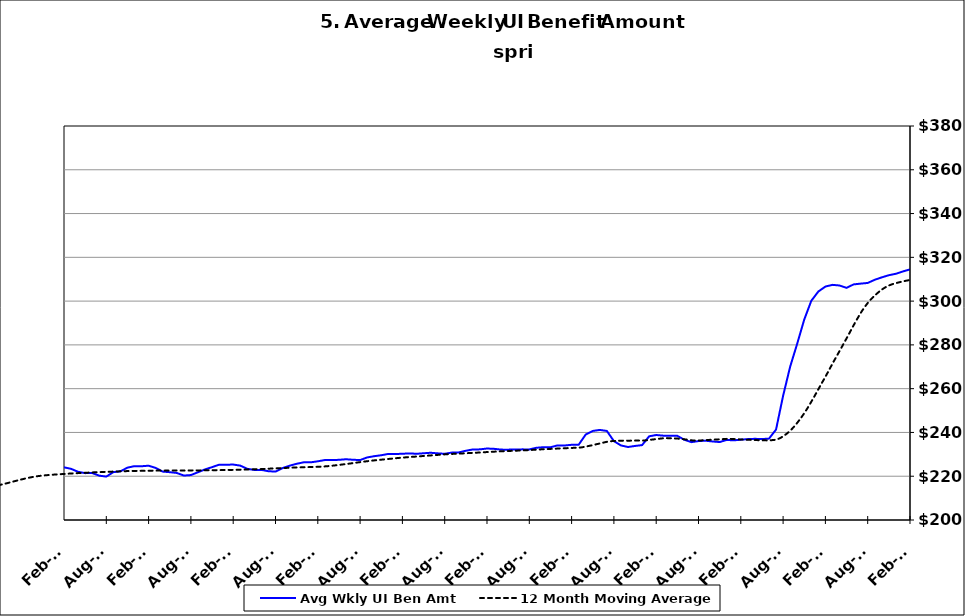
| Category | Avg Wkly UI Ben Amt |
|---|---|
| 1995-01-31 | 152.517 |
| 1995-02-28 | 151.164 |
| 1995-03-31 | 148.4 |
| 1995-04-30 | 146.034 |
| 1995-05-31 | 146.738 |
| 1995-06-30 | 147.885 |
| 1995-07-31 | 145.798 |
| 1995-08-31 | 144.052 |
| 1995-09-30 | 147.334 |
| 1995-10-31 | 151.535 |
| 1995-11-30 | 152.903 |
| 1995-12-31 | 153.258 |
| 1996-01-15 | 153.468 |
| 1996-02-15 | 153.032 |
| 1996-03-15 | 155.453 |
| 1996-04-15 | 148.614 |
| 1996-05-15 | 148.648 |
| 1996-06-15 | 150.145 |
| 1996-07-15 | 147.052 |
| 1996-08-15 | 146.042 |
| 1996-09-15 | 149.978 |
| 1996-10-15 | 151.319 |
| 1996-11-15 | 153.295 |
| 1996-12-15 | 155.775 |
| 1997-01-15 | 154.813 |
| 1997-02-15 | 151.102 |
| 1997-03-15 | 149.222 |
| 1997-04-15 | 145.178 |
| 1997-05-31 | 145.194 |
| 1997-06-30 | 146.718 |
| 1997-07-31 | 142.224 |
| 1997-08-31 | 142.382 |
| 1997-09-30 | 143.123 |
| 1997-10-31 | 146.797 |
| 1997-11-30 | 148.163 |
| 1997-12-31 | 147.967 |
| 1998-01-31 | 147.87 |
| 1998-02-28 | 147.591 |
| 1998-03-31 | 147.262 |
| 1998-04-30 | 144.746 |
| 1998-05-31 | 146.093 |
| 1998-06-30 | 147.355 |
| 1998-07-31 | 146.079 |
| 1998-08-31 | 147.387 |
| 1998-09-30 | 147.529 |
| 1998-10-31 | 152.825 |
| 1998-11-30 | 156.171 |
| 1998-12-31 | 156.424 |
| 1999-01-31 | 157.388 |
| 1999-02-28 | 157.868 |
| 1999-03-31 | 157.505 |
| 1999-04-30 | 153.987 |
| 1999-05-31 | 153.665 |
| 1999-06-30 | 153.746 |
| 1999-07-31 | 154.09 |
| 1999-08-31 | 156.162 |
| 1999-09-30 | 157.136 |
| 1999-10-31 | 162.476 |
| 1999-11-30 | 163.291 |
| 1999-12-31 | 165.621 |
| 2000-01-31 | 166.425 |
| 2000-02-29 | 165.378 |
| 2000-03-31 | 163.05 |
| 2000-04-30 | 161.908 |
| 2000-05-31 | 160.484 |
| 2000-06-30 | 160.865 |
| 2000-07-31 | 161.011 |
| 2000-08-31 | 158.845 |
| 2000-09-30 | 161.127 |
| 2000-10-31 | 163.997 |
| 2000-11-30 | 164.759 |
| 2000-12-31 | 166.66 |
| 2001-01-31 | 168.164 |
| 2001-02-28 | 169.339 |
| 2001-03-31 | 169.617 |
| 2001-04-30 | 170.349 |
| 2001-05-31 | 168.417 |
| 2001-06-30 | 169.418 |
| 2001-07-31 | 169.733 |
| 2001-08-31 | 170.578 |
| 2001-09-30 | 174.36 |
| 2001-10-31 | 176.952 |
| 2001-11-30 | 178.489 |
| 2001-12-31 | 179.805 |
| 2002-01-31 | 179.529 |
| 2002-02-28 | 179.269 |
| 2002-03-31 | 178.588 |
| 2002-04-30 | 177.594 |
| 2002-05-31 | 175.021 |
| 2002-06-30 | 175.298 |
| 2002-07-31 | 173.853 |
| 2002-08-31 | 172.776 |
| 2002-09-30 | 174.657 |
| 2002-10-31 | 175.648 |
| 2002-11-30 | 176.299 |
| 2002-12-31 | 177.239 |
| 2003-01-31 | 176.943 |
| 2003-02-28 | 176.988 |
| 2003-03-31 | 175.698 |
| 2003-04-30 | 172.857 |
| 2003-05-31 | 171.934 |
| 2003-06-30 | 171.956 |
| 2003-07-31 | 170.949 |
| 2003-08-31 | 171.311 |
| 2003-09-30 | 171.909 |
| 2003-10-31 | 172.692 |
| 2003-11-30 | 173.689 |
| 2003-12-31 | 174.176 |
| 2004-01-31 | 173.867 |
| 2004-02-29 | 173.648 |
| 2004-03-31 | 172.152 |
| 2004-04-30 | 170.705 |
| 2004-05-31 | 170.684 |
| 2004-06-30 | 170.635 |
| 2004-07-31 | 171.229 |
| 2004-08-31 | 175.375 |
| 2004-09-30 | 182.737 |
| 2004-10-31 | 187.554 |
| 2004-11-30 | 191.316 |
| 2004-12-31 | 194.602 |
| 2005-01-31 | 196.38 |
| 2005-02-28 | 196.569 |
| 2005-03-31 | 195.523 |
| 2005-04-30 | 193.655 |
| 2005-05-31 | 193.953 |
| 2005-06-30 | 192.728 |
| 2005-07-31 | 192.211 |
| 2005-08-31 | 191.133 |
| 2005-09-30 | 194.339 |
| 2005-10-31 | 196.819 |
| 2005-11-30 | 198.473 |
| 2005-12-31 | 199.545 |
| 2006-01-31 | 199.965 |
| 2006-02-28 | 200.117 |
| 2006-03-31 | 198.335 |
| 2006-04-30 | 197.258 |
| 2006-05-31 | 195.225 |
| 2006-06-30 | 195.734 |
| 2006-07-31 | 194.92 |
| 2006-08-31 | 194.282 |
| 2006-09-30 | 196.801 |
| 2006-10-31 | 199.137 |
| 2006-11-30 | 201.183 |
| 2006-12-31 | 202.121 |
| 2007-01-31 | 202.615 |
| 2007-02-28 | 202.465 |
| 2007-03-31 | 201.75 |
| 2007-04-30 | 200.344 |
| 2007-05-31 | 198.851 |
| 2007-06-30 | 198.258 |
| 2007-07-30 | 197.654 |
| 2007-08-31 | 198.405 |
| 2007-09-30 | 200.563 |
| 2007-10-31 | 201.857 |
| 2007-11-15 | 203.345 |
| 2007-12-15 09:36:00 | 219.243 |
| 2008-01-14 19:12:00 | 219.658 |
| 2008-02-14 04:48:00 | 220.121 |
| 2008-03-15 14:24:00 | 219.456 |
| 2008-04-15 | 217.672 |
| 2008-05-15 09:36:00 | 216.637 |
| 2008-06-14 19:12:00 | 216.035 |
| 2008-07-15 04:48:00 | 213.916 |
| 2008-08-14 14:24:00 | 214.008 |
| 2008-09-14 | 216.475 |
| 2008-10-14 09:36:00 | 217.836 |
| 2008-11-13 19:12:00 | 219.819 |
| 2008-12-14 04:48:00 | 221.529 |
| 2009-01-13 14:24:00 | 222.143 |
| 2009-02-13 | 222.091 |
| 2009-03-15 09:36:00 | 222.273 |
| 2009-04-14 19:12:00 | 222.011 |
| 2009-05-15 04:48:00 | 221.558 |
| 2009-06-14 14:24:00 | 220.761 |
| 2009-07-15 | 219.225 |
| 2009-08-14 09:36:00 | 218.364 |
| 2009-09-13 19:12:00 | 218.814 |
| 2009-10-14 04:48:00 | 218.744 |
| 2009-11-13 14:24:00 | 218.719 |
| 2009-12-14 | 218.779 |
| 2010-01-13 09:36:00 | 217.988 |
| 2010-02-12 19:12:00 | 217.521 |
| 2010-03-15 04:48:00 | 216.93 |
| 2010-04-14 14:24:00 | 215.638 |
| 2010-05-15 | 213.953 |
| 2010-06-14 09:36:00 | 213.326 |
| 2010-07-14 19:12:00 | 211.48 |
| 2010-08-14 04:48:00 | 210.615 |
| 2010-09-13 14:24:00 | 211.554 |
| 2010-10-14 | 211.956 |
| 2010-11-13 09:36:00 | 212.619 |
| 2010-12-13 19:12:00 | 212.979 |
| 2011-01-13 04:48:00 | 212.778 |
| 2011-02-12 14:24:00 | 212.812 |
| 2011-03-15 | 212.631 |
| 2011-04-14 09:36:00 | 211.659 |
| 2011-05-14 19:12:00 | 210.522 |
| 2011-06-14 04:48:00 | 209.652 |
| 2011-07-14 14:24:00 | 208.005 |
| 2011-08-14 | 207.451 |
| 2011-09-13 09:36:00 | 209.173 |
| 2011-10-13 19:12:00 | 209.736 |
| 2011-11-13 04:48:00 | 211.422 |
| 2011-12-13 14:24:00 | 212.679 |
| 2012-01-13 | 212.502 |
| 2012-02-12 09:36:00 | 212.715 |
| 2012-03-13 19:12:00 | 212.846 |
| 2012-04-13 04:48:00 | 212.323 |
| 2012-05-13 14:24:00 | 210.934 |
| 2012-06-13 | 210.073 |
| 2012-07-13 09:36:00 | 208.192 |
| 2012-08-12 19:12:00 | 208.902 |
| 2012-09-12 04:48:00 | 211.616 |
| 2012-10-12 14:24:00 | 214.814 |
| 2012-11-12 | 218.296 |
| 2012-12-12 09:36:00 | 220.532 |
| 2013-01-11 19:12:00 | 221.653 |
| 2013-02-11 04:48:00 | 221.49 |
| 2013-03-13 14:24:00 | 220.877 |
| 2013-04-13 | 220.198 |
| 2013-05-13 09:36:00 | 219.395 |
| 2013-06-12 19:12:00 | 219.716 |
| 2013-07-13 04:48:00 | 218.588 |
| 2013-08-12 14:24:00 | 218.444 |
| 2013-09-12 | 220.248 |
| 2013-10-12 09:36:00 | 221.094 |
| 2013-11-11 19:12:00 | 222.471 |
| 2013-12-12 04:48:00 | 223.964 |
| 2014-01-11 14:24:00 | 224.183 |
| 2014-02-11 | 224.065 |
| 2014-03-13 09:36:00 | 223.376 |
| 2014-04-12 19:12:00 | 222.017 |
| 2014-05-13 04:48:00 | 221.409 |
| 2014-06-12 14:24:00 | 221.458 |
| 2014-07-13 | 220.256 |
| 2014-08-12 09:36:00 | 219.823 |
| 2014-09-11 19:12:00 | 221.87 |
| 2014-10-12 04:48:00 | 222.223 |
| 2014-11-11 14:24:00 | 223.919 |
| 2014-12-12 | 224.606 |
| 2015-01-11 09:36:00 | 224.554 |
| 2015-02-10 19:12:00 | 224.808 |
| 2015-03-13 04:48:00 | 223.795 |
| 2015-04-12 14:24:00 | 222.11 |
| 2015-05-13 | 221.845 |
| 2015-06-12 09:36:00 | 221.492 |
| 2015-07-12 19:12:00 | 220.308 |
| 2015-08-12 04:48:00 | 220.534 |
| 2015-09-11 14:24:00 | 221.819 |
| 2015-10-12 | 223.117 |
| 2015-11-11 09:36:00 | 224.146 |
| 2015-12-11 19:12:00 | 225.264 |
| 2016-01-11 04:48:00 | 225.247 |
| 2016-02-10 14:24:00 | 225.331 |
| 2016-03-12 | 224.849 |
| 2016-04-11 09:36:00 | 223.376 |
| 2016-05-11 19:12:00 | 222.856 |
| 2016-06-11 04:48:00 | 222.895 |
| 2016-07-11 14:24:00 | 222.285 |
| 2016-08-11 | 222.119 |
| 2016-09-10 09:36:00 | 223.72 |
| 2016-10-10 19:12:00 | 224.805 |
| 2016-11-10 04:48:00 | 225.687 |
| 2016-12-10 14:24:00 | 226.349 |
| 2017-01-10 | 226.348 |
| 2017-02-09 09:36:00 | 226.816 |
| 2017-03-11 19:12:00 | 227.395 |
| 2017-04-11 04:48:00 | 227.37 |
| 2017-05-11 14:24:00 | 227.492 |
| 2017-06-11 | 227.755 |
| 2017-07-11 09:36:00 | 227.522 |
| 2017-08-10 19:12:00 | 227.382 |
| 2017-09-10 04:48:00 | 228.581 |
| 2017-10-10 14:24:00 | 229.154 |
| 2017-11-10 | 229.58 |
| 2017-12-10 09:36:00 | 230.186 |
| 2018-01-09 19:12:00 | 230.136 |
| 2018-02-09 04:48:00 | 230.265 |
| 2018-03-11 14:24:00 | 230.427 |
| 2018-04-11 | 230.25 |
| 2018-05-11 09:36:00 | 230.487 |
| 2018-06-10 19:12:00 | 230.714 |
| 2018-07-11 04:48:00 | 230.457 |
| 2018-08-10 14:24:00 | 230.244 |
| 2018-09-10 | 230.802 |
| 2018-10-10 09:36:00 | 230.887 |
| 2018-11-09 19:12:00 | 231.636 |
| 2018-12-10 04:48:00 | 232.24 |
| 2019-01-09 14:24:00 | 232.268 |
| 2019-02-09 | 232.662 |
| 2019-03-11 09:36:00 | 232.508 |
| 2019-04-10 19:12:00 | 232.152 |
| 2019-05-11 04:48:00 | 232.145 |
| 2019-06-10 14:24:00 | 232.186 |
| 2019-07-11 | 232.27 |
| 2019-08-10 09:36:00 | 232.238 |
| 2019-09-09 19:12:00 | 232.999 |
| 2019-10-10 04:48:00 | 233.25 |
| 2019-11-09 14:24:00 | 233.231 |
| 2019-12-10 | 234.074 |
| 2020-01-09 09:36:00 | 234.041 |
| 2020-02-08 19:12:00 | 234.352 |
| 2020-03-10 04:48:00 | 234.377 |
| 2020-04-09 14:24:00 | 239.041 |
| 2020-05-10 | 240.685 |
| 2020-06-09 09:36:00 | 241.153 |
| 2020-07-09 19:12:00 | 240.685 |
| 2020-08-09 04:48:00 | 236.032 |
| 2020-09-08 14:24:00 | 234.062 |
| 2020-10-09 | 233.35 |
| 2020-11-08 09:36:00 | 233.83 |
| 2020-12-08 19:12:00 | 234.208 |
| 2021-01-08 04:48:00 | 238.23 |
| 2021-02-07 14:24:00 | 238.83 |
| 2021-03-10 | 238.528 |
| 2021-04-09 09:36:00 | 238.456 |
| 2021-05-09 19:12:00 | 238.445 |
| 2021-06-09 04:48:00 | 236.633 |
| 2021-07-09 14:24:00 | 235.568 |
| 2021-08-09 | 236.063 |
| 2021-09-08 09:36:00 | 236.227 |
| 2021-10-08 19:12:00 | 235.874 |
| 2021-11-08 04:48:00 | 235.609 |
| 2021-12-08 14:24:00 | 236.585 |
| 2022-01-08 | 236.385 |
| 2022-02-07 09:36:00 | 236.701 |
| 2022-03-09 19:12:00 | 236.956 |
| 2022-04-09 04:48:00 | 237.085 |
| 2022-05-09 14:24:00 | 236.985 |
| 2022-06-09 | 237.182 |
| 2022-07-09 09:36:00 | 241.326 |
| 2022-08-08 19:12:00 | 256.732 |
| 2022-09-08 04:48:00 | 270.047 |
| 2022-10-08 14:24:00 | 280.558 |
| 2022-11-08 | 291.58 |
| 2022-12-08 09:36:00 | 300.147 |
| 2023-01-07 19:12:00 | 304.384 |
| 2023-02-07 04:48:00 | 306.643 |
| 2023-03-09 14:24:00 | 307.431 |
| 2023-04-09 | 307.14 |
| 2023-05-09 09:36:00 | 306.055 |
| 2023-06-08 19:12:00 | 307.634 |
| 2023-07-09 04:48:00 | 307.988 |
| 2023-08-08 14:24:00 | 308.295 |
| 2023-09-08 | 309.743 |
| 2023-10-08 09:36:00 | 310.856 |
| 2023-11-07 19:12:00 | 311.833 |
| 2023-12-08 04:48:00 | 312.49 |
| 2024-01-07 14:24:00 | 313.561 |
| 2024-02-07 | 314.483 |